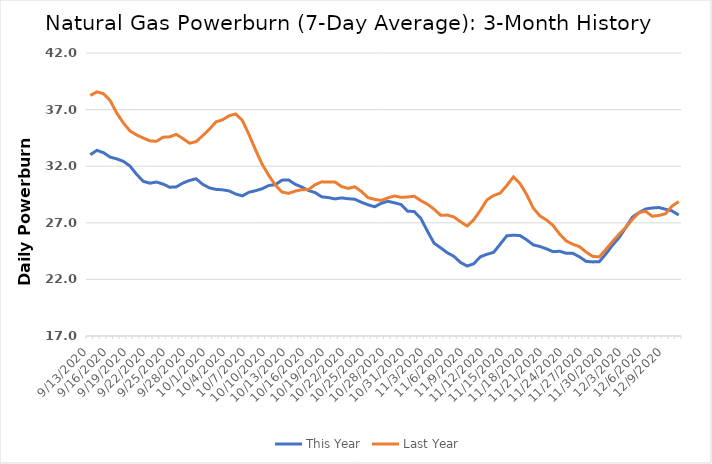
| Category | This Year | Last Year |
|---|---|---|
| 9/13/2020 | 33.016 | 38.247 |
| 9/14/2020 | 33.401 | 38.565 |
| 9/15/2020 | 33.194 | 38.404 |
| 9/16/2020 | 32.8 | 37.8 |
| 9/17/2020 | 32.649 | 36.688 |
| 9/18/2020 | 32.43 | 35.817 |
| 9/19/2020 | 32.017 | 35.116 |
| 9/20/2020 | 31.283 | 34.76 |
| 9/21/2020 | 30.665 | 34.491 |
| 9/22/2020 | 30.499 | 34.243 |
| 9/23/2020 | 30.6 | 34.2 |
| 9/24/2020 | 30.424 | 34.562 |
| 9/25/2020 | 30.144 | 34.593 |
| 9/26/2020 | 30.172 | 34.81 |
| 9/27/2020 | 30.509 | 34.447 |
| 9/28/2020 | 30.737 | 34.033 |
| 9/29/2020 | 30.89 | 34.17 |
| 9/30/2020 | 30.4 | 34.7 |
| 10/1/2020 | 30.088 | 35.26 |
| 10/2/2020 | 29.952 | 35.913 |
| 10/3/2020 | 29.914 | 36.099 |
| 10/4/2020 | 29.813 | 36.457 |
| 10/5/2020 | 29.542 | 36.618 |
| 10/6/2020 | 29.376 | 36.04 |
| 10/7/2020 | 29.7 | 34.8 |
| 10/8/2020 | 29.835 | 33.427 |
| 10/9/2020 | 30.011 | 32.165 |
| 10/10/2020 | 30.296 | 31.182 |
| 10/11/2020 | 30.371 | 30.321 |
| 10/12/2020 | 30.769 | 29.714 |
| 10/13/2020 | 30.784 | 29.601 |
| 10/14/2020 | 30.4 | 29.8 |
| 10/15/2020 | 30.161 | 29.927 |
| 10/16/2020 | 29.852 | 29.935 |
| 10/17/2020 | 29.669 | 30.363 |
| 10/18/2020 | 29.293 | 30.619 |
| 10/19/2020 | 29.23 | 30.595 |
| 10/20/2020 | 29.109 | 30.614 |
| 10/21/2020 | 29.2 | 30.2 |
| 10/22/2020 | 29.126 | 30.041 |
| 10/23/2020 | 29.083 | 30.179 |
| 10/24/2020 | 28.816 | 29.773 |
| 10/25/2020 | 28.594 | 29.222 |
| 10/26/2020 | 28.414 | 29.068 |
| 10/27/2020 | 28.72 | 28.983 |
| 10/28/2020 | 28.9 | 29.2 |
| 10/29/2020 | 28.767 | 29.367 |
| 10/30/2020 | 28.613 | 29.25 |
| 10/31/2020 | 28.03 | 29.281 |
| 11/1/2020 | 27.993 | 29.347 |
| 11/2/2020 | 27.383 | 28.955 |
| 11/3/2020 | 26.25 | 28.64 |
| 11/4/2020 | 25.2 | 28.2 |
| 11/5/2020 | 24.787 | 27.66 |
| 11/6/2020 | 24.354 | 27.682 |
| 11/7/2020 | 24.034 | 27.514 |
| 11/8/2020 | 23.496 | 27.094 |
| 11/9/2020 | 23.182 | 26.718 |
| 11/10/2020 | 23.376 | 27.27 |
| 11/11/2020 | 24 | 28.1 |
| 11/12/2020 | 24.219 | 29.03 |
| 11/13/2020 | 24.385 | 29.405 |
| 11/14/2020 | 25.107 | 29.624 |
| 11/15/2020 | 25.853 | 30.296 |
| 11/16/2020 | 25.904 | 31.052 |
| 11/17/2020 | 25.874 | 30.46 |
| 11/18/2020 | 25.5 | 29.5 |
| 11/19/2020 | 25.051 | 28.302 |
| 11/20/2020 | 24.91 | 27.611 |
| 11/21/2020 | 24.7 | 27.254 |
| 11/22/2020 | 24.45 | 26.765 |
| 11/23/2020 | 24.487 | 25.994 |
| 11/24/2020 | 24.305 | 25.394 |
| 11/25/2020 | 24.3 | 25.1 |
| 11/26/2020 | 23.99 | 24.886 |
| 11/27/2020 | 23.59 | 24.415 |
| 11/28/2020 | 23.545 | 24.026 |
| 11/29/2020 | 23.568 | 23.994 |
| 11/30/2020 | 24.26 | 24.653 |
| 12/1/2020 | 25.031 | 25.361 |
| 12/2/2020 | 25.7 | 26 |
| 12/3/2020 | 26.582 | 26.593 |
| 12/4/2020 | 27.504 | 27.307 |
| 12/5/2020 | 27.904 | 27.899 |
| 12/6/2020 | 28.218 | 28.019 |
| 12/7/2020 | 28.308 | 27.578 |
| 12/8/2020 | 28.348 | 27.649 |
| 12/9/2020 | 28.2 | 27.8 |
| 12/10/2020 | 28.047 | 28.481 |
| 12/11/2020 | 27.686 | 28.875 |